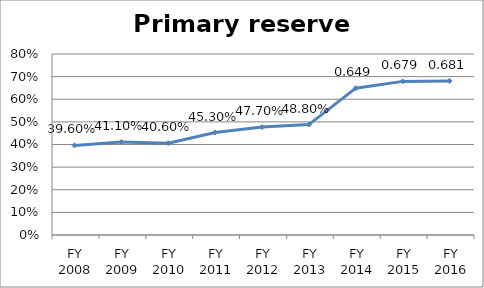
| Category | Primary reserve ratio |
|---|---|
| FY 2016 | 0.681 |
| FY 2015 | 0.679 |
| FY 2014 | 0.649 |
| FY 2013 | 0.488 |
| FY 2012 | 0.477 |
| FY 2011 | 0.453 |
| FY 2010 | 0.406 |
| FY 2009 | 0.411 |
| FY 2008 | 0.396 |